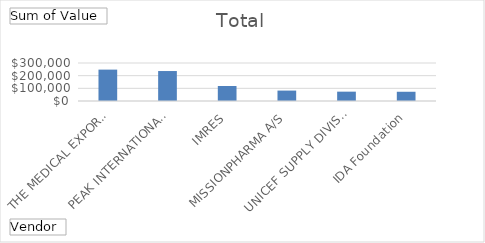
| Category | Total |
|---|---|
| THE MEDICAL EXPORT GROUP BV | 247759.45 |
| PEAK INTERNATIONAL TRADE (TIANJIN)CO LTD | 236600 |
| IMRES | 118222.05 |
| MISSIONPHARMA A/S | 82200 |
| UNICEF SUPPLY DIVISION | 73763.61 |
| IDA Foundation | 72930 |